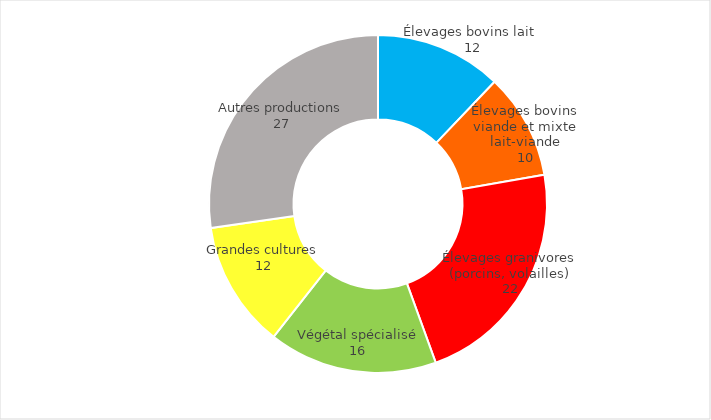
| Category | Series 0 |
|---|---|
| Élevages bovins lait  | 12 |
| Élevages bovins viande et mixte lait-viande | 10 |
| Élevages granivores (porcins, volailles) | 22 |
| Végétal spécialisé | 16 |
| Grandes cultures | 12 |
| Autres productions | 27 |